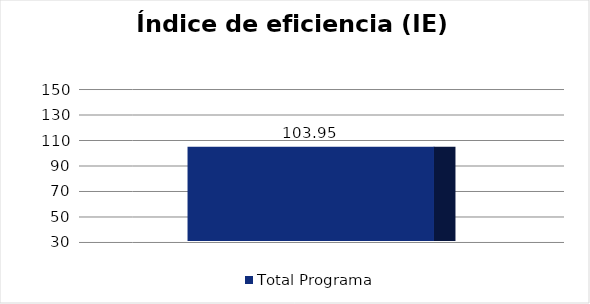
| Category |  Total Programa  |
|---|---|
|  Índice de eficiencia (IE)   | 103.949 |